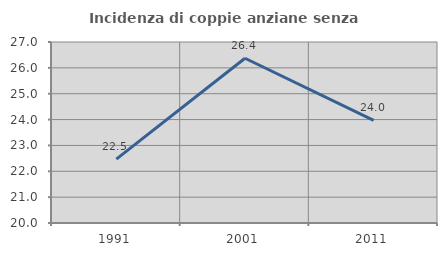
| Category | Incidenza di coppie anziane senza figli  |
|---|---|
| 1991.0 | 22.468 |
| 2001.0 | 26.372 |
| 2011.0 | 23.967 |